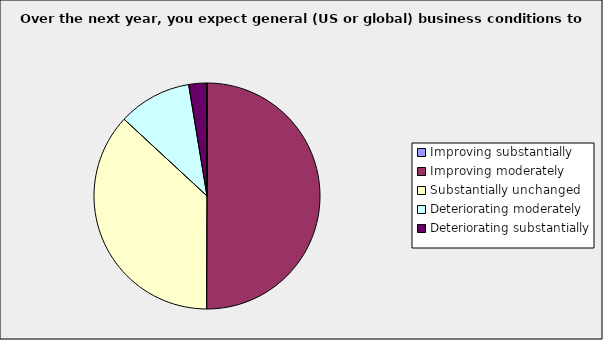
| Category | Series 0 |
|---|---|
| Improving substantially | 0 |
| Improving moderately | 0.5 |
| Substantially unchanged | 0.368 |
| Deteriorating moderately | 0.105 |
| Deteriorating substantially | 0.026 |